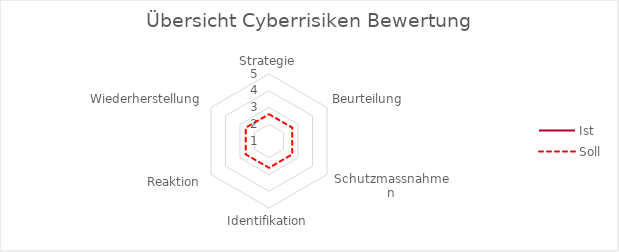
| Category | Ist | Soll |
|---|---|---|
| Strategie | 1 | 2.6 |
| Beurteilung | 1 | 2.6 |
| Schutzmassnahmen | 1 | 2.6 |
| Identifikation | 1 | 2.6 |
| Reaktion | 1 | 2.6 |
| Wiederherstellung | 1 | 2.6 |